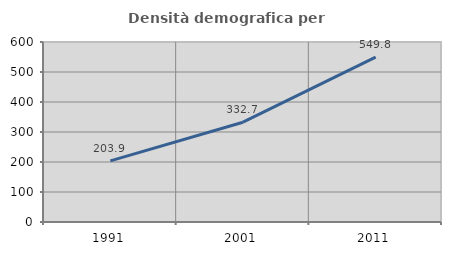
| Category | Densità demografica |
|---|---|
| 1991.0 | 203.871 |
| 2001.0 | 332.685 |
| 2011.0 | 549.789 |